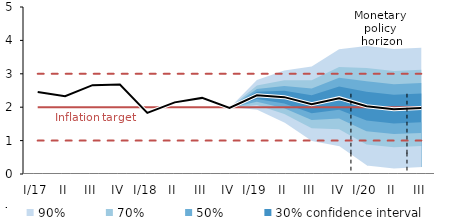
| Category | Inflation Target | Inflation Target - lower bound | Inflation Target - upper bound | linka | Centerline |
|---|---|---|---|---|---|
| I/17 | 2 | 1 | 3 | 2.455 | 2.455 |
| II | 2 | 1 | 3 | 2.327 | 2.327 |
| III | 2 | 1 | 3 | 2.66 | 2.66 |
| IV | 2 | 1 | 3 | 2.677 | 2.677 |
| I/18 | 2 | 1 | 3 | 1.831 | 1.831 |
| II | 2 | 1 | 3 | 2.145 | 2.145 |
| III | 2 | 1 | 3 | 2.279 | 2.279 |
| IV | 2 | 1 | 3 | 1.979 | 1.979 |
| I/19 | 2 | 1 | 3 | 2.355 | 2.355 |
| II | 2 | 1 | 3 | 2.301 | 2.301 |
| III | 2 | 1 | 3 | 2.089 | 2.089 |
| IV | 2 | 1 | 3 | 2.27 | 2.27 |
| I/20 | 2 | 1 | 3 | 2.031 | 2.031 |
| II | 2 | 1 | 3 | 1.942 | 1.942 |
| III | 2 | 1 | 3 | 1.979 | 1.979 |